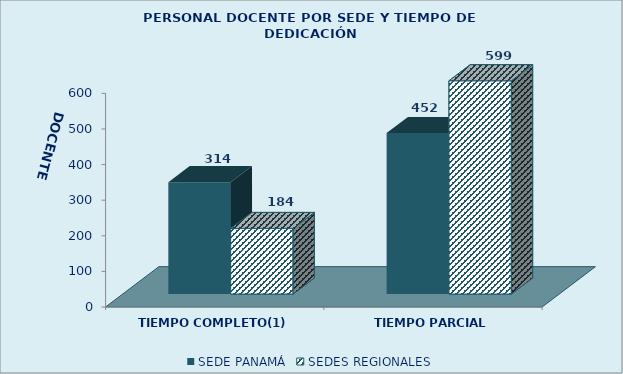
| Category | SEDE PANAMÁ | SEDES REGIONALES |
|---|---|---|
| TIEMPO COMPLETO(1) | 314 | 184 |
| TIEMPO PARCIAL | 452 | 599 |